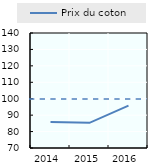
| Category | Prix du coton |
|---|---|
| 2014.0 | 85.801 |
| 2015.0 | 85.33 |
| 2016.0 | 95.781 |